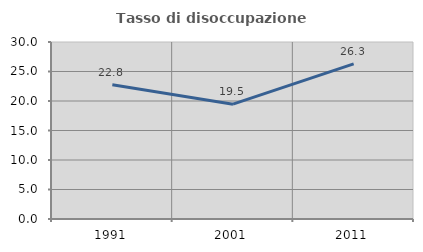
| Category | Tasso di disoccupazione giovanile  |
|---|---|
| 1991.0 | 22.763 |
| 2001.0 | 19.466 |
| 2011.0 | 26.291 |